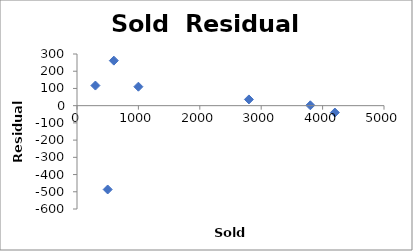
| Category | Series 0 |
|---|---|
| 3800.0 | 2.11 |
| 300.0 | 116.773 |
| 500.0 | -486.722 |
| 600.0 | 261.53 |
| 4200.0 | -40.02 |
| 2800.0 | 36.195 |
| 1000.0 | 110.134 |